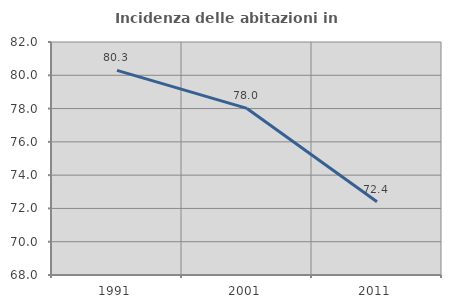
| Category | Incidenza delle abitazioni in proprietà  |
|---|---|
| 1991.0 | 80.297 |
| 2001.0 | 78.008 |
| 2011.0 | 72.407 |